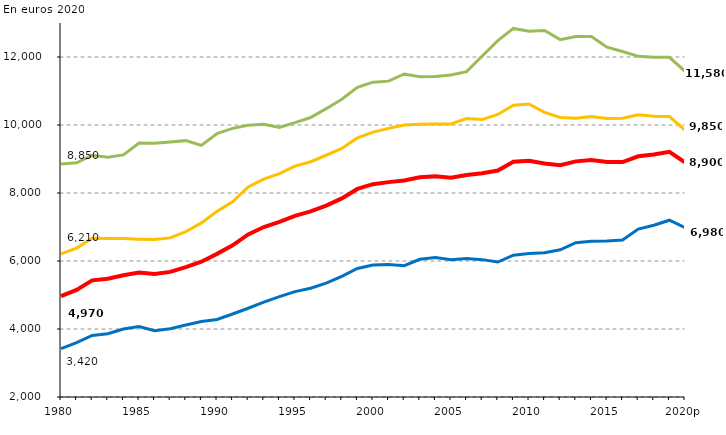
| Category | Dépense moyenne par élève | Dépense moyenne pour un élève du 1er degré | Dépense moyenne pour un élève du 2d degré | Dépense moyenne pour un élève du supérieur |
|---|---|---|---|---|
| 1980 | 4970 | 3420 | 6210 | 8850 |
| 1981 | 5150 | 3600 | 6380 | 8890 |
| 1982 | 5430 | 3810 | 6670 | 9110 |
| 1983 | 5480 | 3860 | 6660 | 9050 |
| 1984 | 5580 | 4000 | 6660 | 9120 |
| 1985 | 5660 | 4070 | 6640 | 9470 |
| 1986 | 5620 | 3950 | 6630 | 9460 |
| 1987 | 5680 | 4010 | 6680 | 9500 |
| 1988 | 5820 | 4120 | 6860 | 9540 |
| 1989 | 5980 | 4220 | 7120 | 9400 |
| 1990 | 6210 | 4280 | 7460 | 9750 |
| 1991 | 6460 | 4440 | 7740 | 9900 |
| 1992 | 6780 | 4610 | 8180 | 9990 |
| 1993 | 7000 | 4790 | 8410 | 10020 |
| 1994 | 7150 | 4950 | 8570 | 9930 |
| 1995 | 7330 | 5100 | 8790 | 10070 |
| 1996 | 7460 | 5200 | 8920 | 10220 |
| 1997 | 7630 | 5350 | 9110 | 10480 |
| 1998 | 7840 | 5550 | 9310 | 10760 |
| 1999 | 8120 | 5780 | 9620 | 11110 |
| 2000 | 8260 | 5880 | 9790 | 11260 |
| 2001 | 8320 | 5900 | 9900 | 11290 |
| 2002 | 8370 | 5860 | 10000 | 11500 |
| 2003 | 8460 | 6050 | 10020 | 11420 |
| 2004 | 8490 | 6100 | 10030 | 11430 |
| 2005 | 8450 | 6040 | 10030 | 11470 |
| 2006 | 8530 | 6070 | 10190 | 11570 |
| 2007 | 8580 | 6040 | 10160 | 12030 |
| 2008 | 8660 | 5970 | 10310 | 12480 |
| 2009 | 8920 | 6170 | 10580 | 12840 |
| 2010 | 8950 | 6220 | 10620 | 12760 |
| 2011 | 8870 | 6240 | 10370 | 12780 |
| 2012 | 8820 | 6330 | 10220 | 12510 |
| 2013 | 8930 | 6540 | 10200 | 12600 |
| 2014 | 8970 | 6580 | 10250 | 12600 |
| 2015 | 8910 | 6590 | 10190 | 12290 |
| 2016 | 8910 | 6620 | 10200 | 12160 |
| 2017 | 9080 | 6940 | 10300 | 12020 |
| 2018 | 9130 | 7050 | 10260 | 11990 |
| 2019 | 9210 | 7200 | 10250 | 11990 |
| 2020p | 8900 | 6980 | 9850 | 11580 |